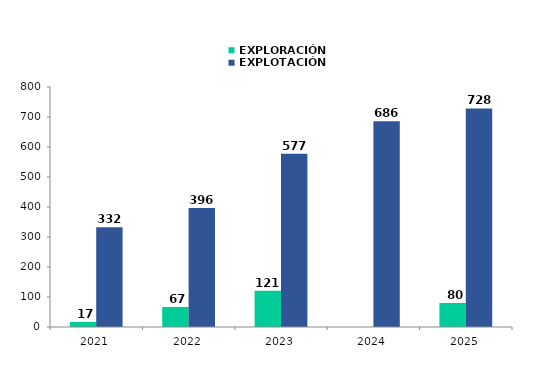
| Category | EXPLORACIÓN | EXPLOTACIÓN |
|---|---|---|
| 2021.0 | 16.963 | 332.289 |
| 2022.0 | 66.785 | 396.445 |
| 2023.0 | 121 | 577.463 |
| 2024.0 | 0 | 685.694 |
| 2025.0 | 80 | 728.46 |